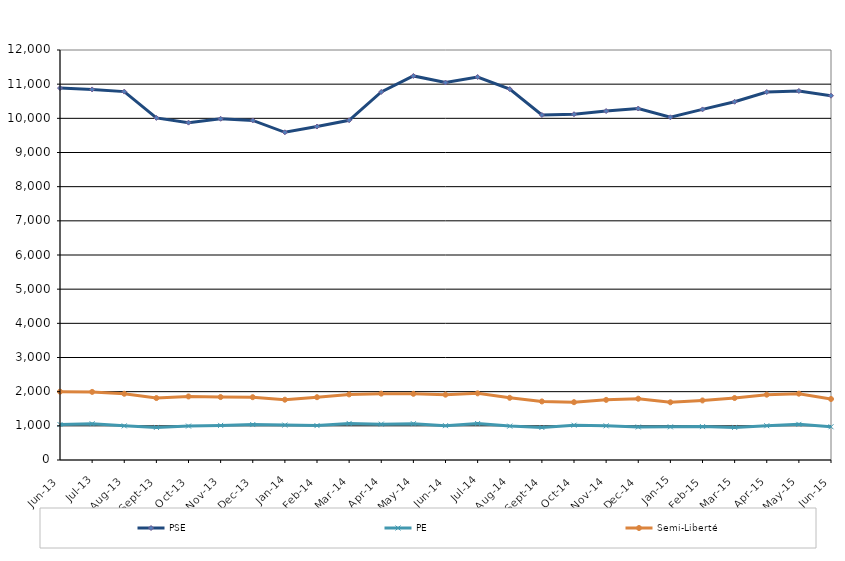
| Category | PSE | PE | Semi-Liberté |
|---|---|---|---|
| 2013-06-01 | 10886 | 1038 | 2000 |
| 2013-07-01 | 10846 | 1061 | 1993 |
| 2013-08-01 | 10782 | 999 | 1939 |
| 2013-09-01 | 10013 | 954 | 1813 |
| 2013-10-01 | 9874 | 993 | 1860 |
| 2013-11-01 | 9987 | 1013 | 1842 |
| 2013-12-01 | 9938 | 1037 | 1838 |
| 2014-01-01 | 9591 | 1022 | 1765 |
| 2014-02-01 | 9760 | 1007 | 1838 |
| 2014-03-01 | 9943 | 1071 | 1920 |
| 2014-04-01 | 10773 | 1050 | 1942 |
| 2014-05-01 | 11241 | 1062 | 1937 |
| 2014-06-01 | 11048 | 1005 | 1912 |
| 2014-07-01 | 11210 | 1068 | 1951 |
| 2014-08-01 | 10856 | 992 | 1820 |
| 2014-09-01 | 10098 | 951 | 1714 |
| 2014-10-01 | 10120 | 1018 | 1692 |
| 2014-11-01 | 10213 | 1000 | 1760 |
| 2014-12-01 | 10287 | 966 | 1794 |
| 2015-01-01 | 10030 | 970 | 1689 |
| 2015-02-01 | 10261 | 977 | 1743 |
| 2015-03-01 | 10485 | 954 | 1814 |
| 2015-04-01 | 10770 | 1003 | 1912 |
| 2015-05-01 | 10801 | 1043 | 1941 |
| 2015-06-01 | 10662 | 973 | 1785 |